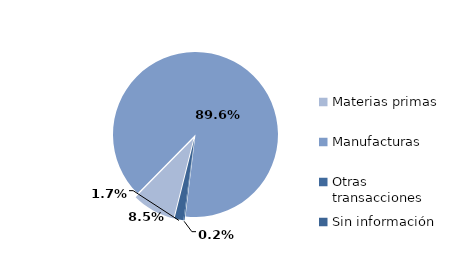
| Category | Series 0 |
|---|---|
| Materias primas | 1580.201 |
| Manufacturas | 16685.958 |
| Otras transacciones | 40.71 |
| Sin información | 323.858 |